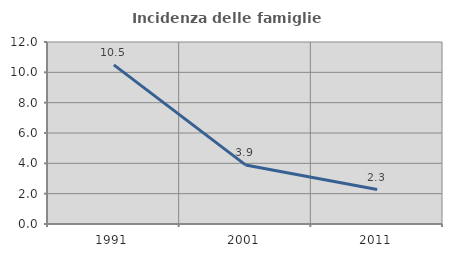
| Category | Incidenza delle famiglie numerose |
|---|---|
| 1991.0 | 10.49 |
| 2001.0 | 3.896 |
| 2011.0 | 2.273 |